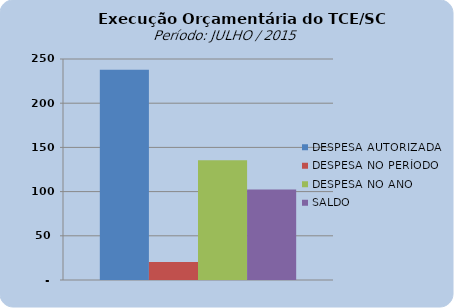
| Category | DESPESA AUTORIZADA | DESPESA NO PERÍODO | DESPESA NO ANO | SALDO |
|---|---|---|---|---|
| 0 | 237824239.22 | 20387269.16 | 135355231.88 | 102469007.34 |